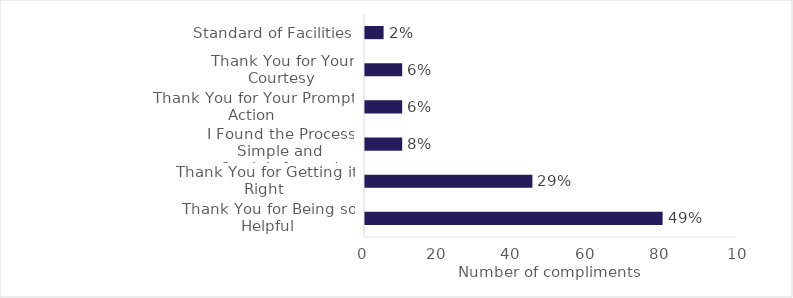
| Category | Series 0 |
|---|---|
| Thank You for Being so Helpful | 80 |
| Thank You for Getting it Right | 45 |
| I Found the Process Simple and Straightforward | 10 |
| Thank You for Your Prompt Action | 10 |
| Thank You for Your Courtesy | 10 |
| Standard of Facilities | 5 |